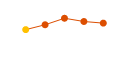
| Category | Other variable cost |
|---|---|
| 0 | 1 |
| 1 | 1.2 |
| 2 | 1.467 |
| 3 | 1.333 |
| 4 | 1.267 |